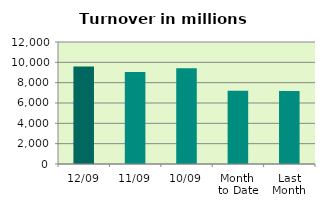
| Category | Series 0 |
|---|---|
| 12/09 | 9599.635 |
| 11/09 | 9043.91 |
| 10/09 | 9429.954 |
| Month 
to Date | 7215.088 |
| Last
Month | 7181.07 |